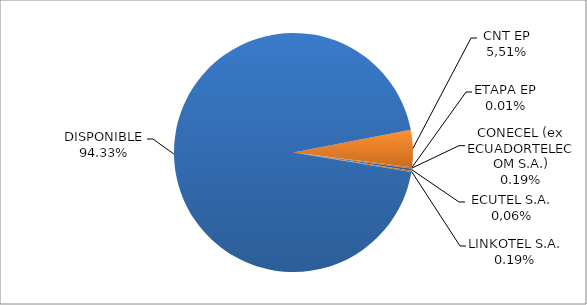
| Category | CODIGO DE AREA 5 |
|---|---|
| CORPORACIÓN NACIONAL TELECOMUNICACIONES CNT EP | 0.05 |
| ETAPA EP | 0 |
| CONECEL (ex ECUADORTELECOM S.A.) | 0.002 |
| SETEL S.A. | 0.002 |
| LINKOTEL S.A. | 0.002 |
| DISPONIBLE | 0.943 |